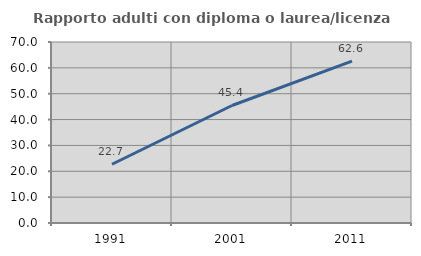
| Category | Rapporto adulti con diploma o laurea/licenza media  |
|---|---|
| 1991.0 | 22.712 |
| 2001.0 | 45.449 |
| 2011.0 | 62.613 |